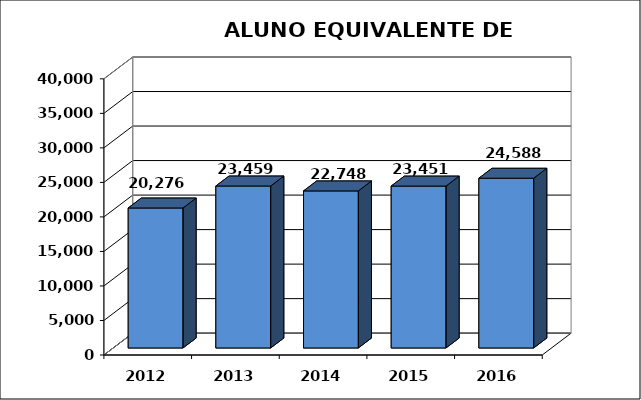
| Category | Series 0 |
|---|---|
| 2012.0 | 20275.827 |
| 2013.0 | 23459.371 |
| 2014.0 | 22747.712 |
| 2015.0 | 23451.239 |
| 2016.0 | 24587.562 |